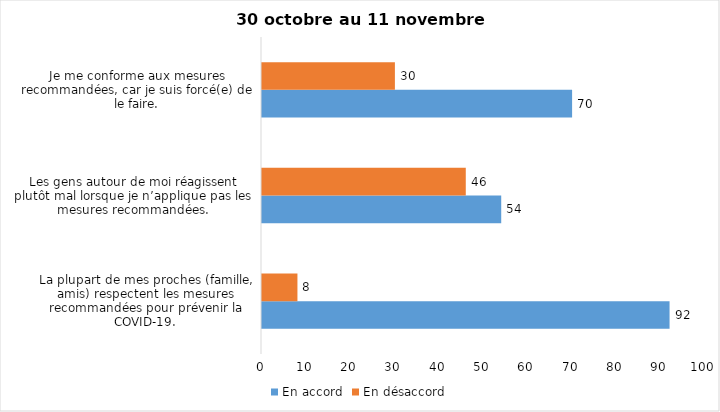
| Category | En accord | En désaccord |
|---|---|---|
| La plupart de mes proches (famille, amis) respectent les mesures recommandées pour prévenir la COVID-19. | 92 | 8 |
| Les gens autour de moi réagissent plutôt mal lorsque je n’applique pas les mesures recommandées. | 54 | 46 |
| Je me conforme aux mesures recommandées, car je suis forcé(e) de le faire. | 70 | 30 |